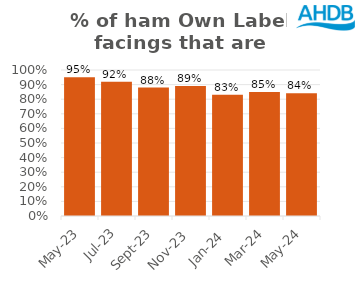
| Category | Ham |
|---|---|
| 2023-05-01 | 0.95 |
| 2023-07-01 | 0.92 |
| 2023-09-01 | 0.88 |
| 2023-11-01 | 0.89 |
| 2024-01-01 | 0.83 |
| 2024-03-01 | 0.85 |
| 2024-05-01 | 0.84 |